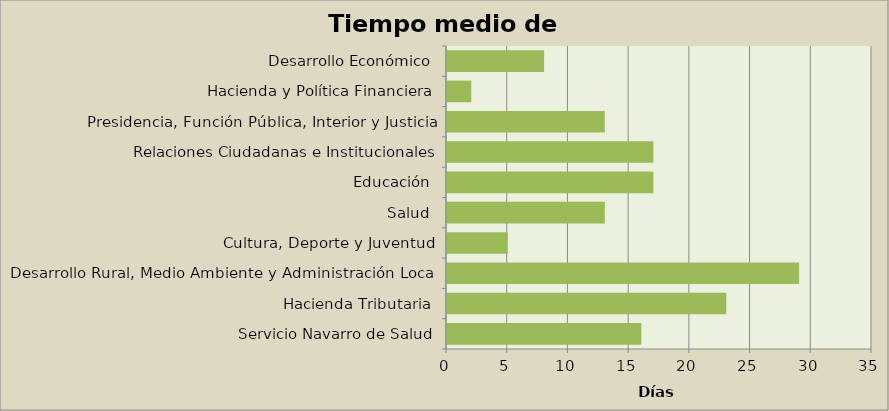
| Category | Series 0 | Series 1 | Series 2 |
|---|---|---|---|
| Servicio Navarro de Salud |  |  | 16 |
| Hacienda Tributaria |  |  | 23 |
| Desarrollo Rural, Medio Ambiente y Administración Local |  |  | 29 |
| Cultura, Deporte y Juventud |  |  | 5 |
| Salud |  |  | 13 |
| Educación |  |  | 17 |
| Relaciones Ciudadanas e Institucionales |  |  | 17 |
| Presidencia, Función Pública, Interior y Justicia |  |  | 13 |
| Hacienda y Política Financiera |  |  | 2 |
| Desarrollo Económico |  |  | 8 |